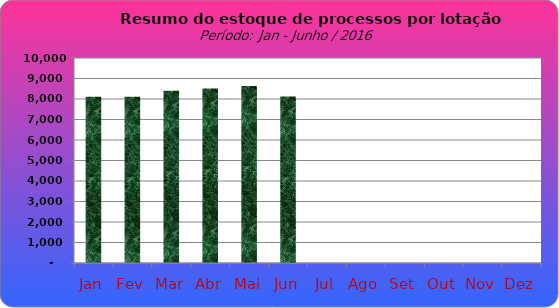
| Category | Series 0 |
|---|---|
| Jan | 8111 |
| Fev | 8114 |
| Mar | 8403 |
| Abr | 8512 |
| Mai | 8633 |
| Jun | 8120 |
| Jul | 0 |
| Ago | 0 |
| Set | 0 |
| Out | 0 |
| Nov | 0 |
| Dez | 0 |